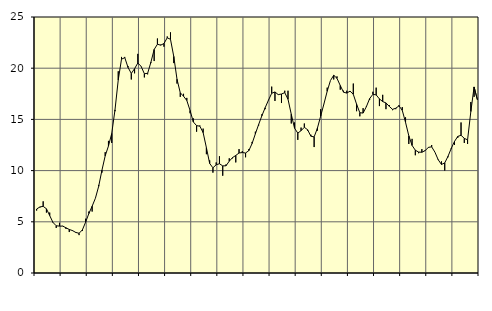
| Category | Piggar | Series 1 |
|---|---|---|
| nan | 6.1 | 6.25 |
| 87.0 | 6.4 | 6.45 |
| 87.0 | 7 | 6.51 |
| 87.0 | 5.9 | 6.27 |
| nan | 5.9 | 5.61 |
| 88.0 | 4.9 | 4.94 |
| 88.0 | 4.4 | 4.61 |
| 88.0 | 4.9 | 4.58 |
| nan | 4.6 | 4.58 |
| 89.0 | 4.3 | 4.41 |
| 89.0 | 4 | 4.25 |
| 89.0 | 4.1 | 4.14 |
| nan | 4 | 3.96 |
| 90.0 | 3.7 | 3.88 |
| 90.0 | 4.1 | 4.2 |
| 90.0 | 5.3 | 4.96 |
| nan | 6 | 5.81 |
| 91.0 | 6 | 6.52 |
| 91.0 | 7.3 | 7.3 |
| 91.0 | 8.6 | 8.46 |
| nan | 9.8 | 10.03 |
| 92.0 | 11.8 | 11.44 |
| 92.0 | 12.9 | 12.4 |
| 92.0 | 12.7 | 13.62 |
| nan | 15.8 | 15.93 |
| 93.0 | 19.7 | 18.86 |
| 93.0 | 21.1 | 20.88 |
| 93.0 | 21.1 | 21.03 |
| nan | 20.2 | 20.07 |
| 94.0 | 18.9 | 19.49 |
| 94.0 | 19.5 | 19.95 |
| 94.0 | 21.4 | 20.51 |
| nan | 20.2 | 20.18 |
| 95.0 | 19.1 | 19.46 |
| 95.0 | 19.4 | 19.5 |
| 95.0 | 20.5 | 20.58 |
| nan | 20.7 | 21.83 |
| 96.0 | 22.9 | 22.34 |
| 96.0 | 22.3 | 22.25 |
| 96.0 | 22.1 | 22.41 |
| nan | 23.1 | 22.97 |
| 97.0 | 23.5 | 22.82 |
| 97.0 | 20.5 | 21.15 |
| 97.0 | 18.5 | 18.92 |
| nan | 17.2 | 17.6 |
| 98.0 | 17.5 | 17.26 |
| 98.0 | 17.1 | 16.85 |
| 98.0 | 15.6 | 15.87 |
| nan | 15.1 | 14.75 |
| 99.0 | 13.8 | 14.39 |
| 99.0 | 14.4 | 14.34 |
| 99.0 | 14.1 | 13.71 |
| nan | 11.6 | 12.24 |
| 0.0 | 11 | 10.7 |
| 0.0 | 9.8 | 10.27 |
| 0.0 | 10.8 | 10.57 |
| nan | 11.4 | 10.67 |
| 1.0 | 9.5 | 10.46 |
| 1.0 | 10.6 | 10.47 |
| 1.0 | 11.2 | 10.92 |
| nan | 11.2 | 11.27 |
| 2.0 | 10.8 | 11.48 |
| 2.0 | 12.1 | 11.72 |
| 2.0 | 11.9 | 11.76 |
| nan | 11.3 | 11.72 |
| 3.0 | 12.1 | 11.95 |
| 3.0 | 12.8 | 12.65 |
| 3.0 | 13.8 | 13.59 |
| nan | 14.4 | 14.5 |
| 4.0 | 15.5 | 15.36 |
| 4.0 | 16 | 16.14 |
| 4.0 | 16.9 | 16.87 |
| nan | 18.2 | 17.55 |
| 5.0 | 16.8 | 17.68 |
| 5.0 | 17.4 | 17.42 |
| 5.0 | 16.6 | 17.48 |
| nan | 17.8 | 17.61 |
| 6.0 | 17.8 | 16.97 |
| 6.0 | 14.6 | 15.5 |
| 6.0 | 14.7 | 14.14 |
| nan | 13 | 13.66 |
| 7.0 | 14.2 | 13.9 |
| 7.0 | 14.6 | 14.23 |
| 7.0 | 13.9 | 13.99 |
| nan | 13.5 | 13.36 |
| 8.0 | 12.3 | 13.29 |
| 8.0 | 13.9 | 14.14 |
| 8.0 | 16 | 15.32 |
| nan | 16.5 | 16.51 |
| 9.0 | 18.1 | 17.75 |
| 9.0 | 18.8 | 18.8 |
| 9.0 | 18.9 | 19.31 |
| nan | 19.2 | 19.01 |
| 10.0 | 17.9 | 18.31 |
| 10.0 | 17.8 | 17.66 |
| 10.0 | 17.8 | 17.57 |
| nan | 17.7 | 17.76 |
| 11.0 | 18.5 | 17.45 |
| 11.0 | 15.8 | 16.49 |
| 11.0 | 15.3 | 15.65 |
| nan | 16.1 | 15.62 |
| 12.0 | 16.3 | 16.24 |
| 12.0 | 16.9 | 17.03 |
| 12.0 | 17.7 | 17.45 |
| nan | 18.1 | 17.39 |
| 13.0 | 16.3 | 17 |
| 13.0 | 17.4 | 16.74 |
| 13.0 | 16 | 16.61 |
| nan | 16.4 | 16.28 |
| 14.0 | 15.9 | 15.98 |
| 14.0 | 16 | 16.09 |
| 14.0 | 16.4 | 16.32 |
| nan | 16.2 | 15.88 |
| 15.0 | 15.2 | 14.71 |
| 15.0 | 12.6 | 13.4 |
| 15.0 | 13.1 | 12.46 |
| nan | 11.5 | 11.99 |
| 16.0 | 11.7 | 11.81 |
| 16.0 | 12.1 | 11.79 |
| 16.0 | 12 | 11.95 |
| nan | 12.3 | 12.27 |
| 17.0 | 12.5 | 12.32 |
| 17.0 | 11.8 | 11.8 |
| 17.0 | 11.1 | 11.06 |
| nan | 10.9 | 10.6 |
| 18.0 | 10 | 10.75 |
| 18.0 | 11.3 | 11.39 |
| 18.0 | 12.1 | 12.17 |
| nan | 12.5 | 12.85 |
| 19.0 | 13.2 | 13.34 |
| 19.0 | 14.7 | 13.45 |
| 19.0 | 12.7 | 13.15 |
| nan | 12.6 | 13 |
| 20.0 | 16.7 | 15.77 |
| 20.0 | 17.2 | 18.17 |
| 20.0 | 16.9 | 16.93 |